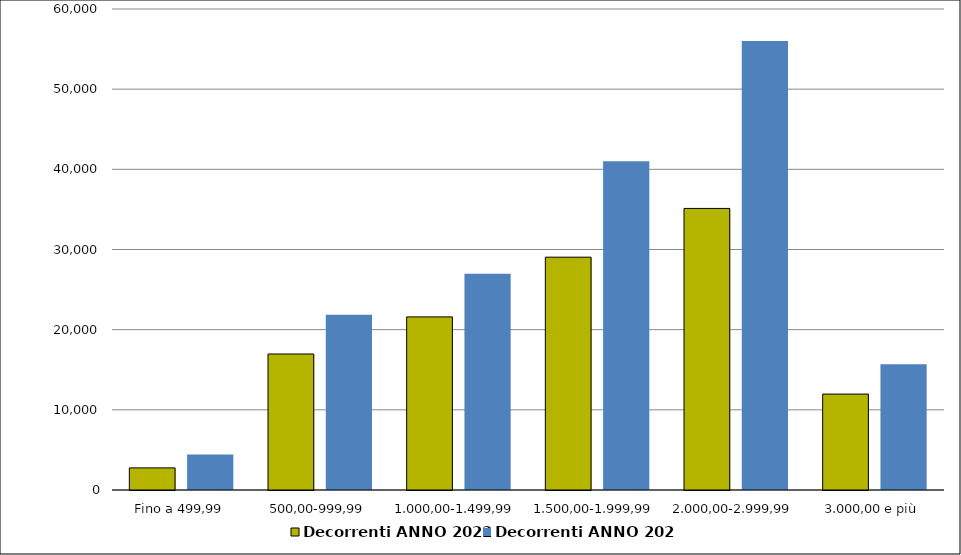
| Category | Decorrenti ANNO 2022 | Decorrenti ANNO 2021 |
|---|---|---|
|  Fino a 499,99  | 2758 | 4432 |
|  500,00-999,99  | 16963 | 21847 |
|  1.000,00-1.499,99  | 21594 | 26961 |
|  1.500,00-1.999,99  | 29043 | 40995 |
|  2.000,00-2.999,99  | 35124 | 56010 |
|  3.000,00 e più  | 11966 | 15693 |